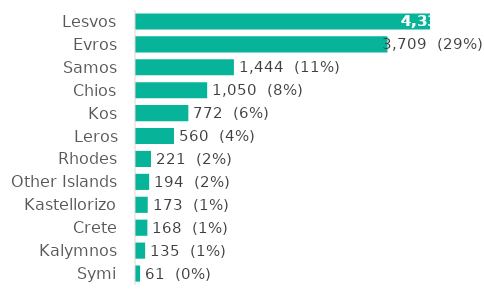
| Category | Series 0 |
|---|---|
| Lesvos | 4337 |
| Evros | 3709 |
| Samos | 1444 |
| Chios | 1050 |
| Kos | 772 |
| Leros | 560 |
| Rhodes | 221 |
| Other Islands | 194 |
| Kastellorizo | 173 |
| Crete | 168 |
| Kalymnos | 135 |
| Symi | 61 |